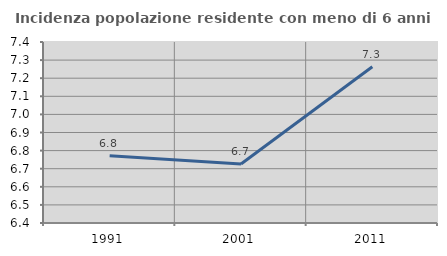
| Category | Incidenza popolazione residente con meno di 6 anni |
|---|---|
| 1991.0 | 6.771 |
| 2001.0 | 6.726 |
| 2011.0 | 7.263 |